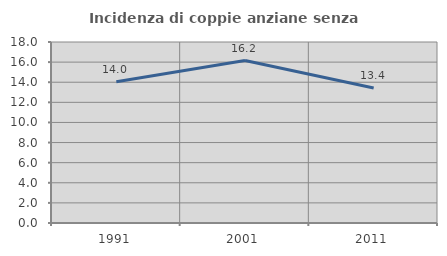
| Category | Incidenza di coppie anziane senza figli  |
|---|---|
| 1991.0 | 14.04 |
| 2001.0 | 16.159 |
| 2011.0 | 13.419 |